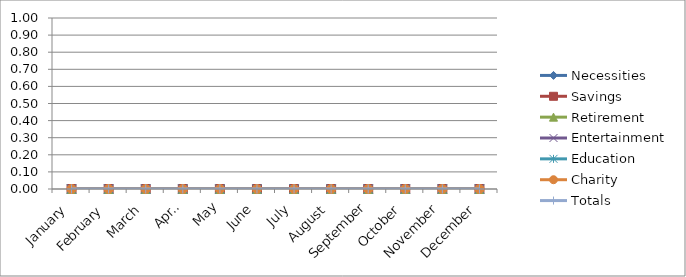
| Category | Necessities | Savings | Retirement | Entertainment | Education | Charity | Totals |
|---|---|---|---|---|---|---|---|
| January | 0 | 0 | 0 | 0 | 0 | 0 | 0 |
| February | 0 | 0 | 0 | 0 | 0 | 0 | 0 |
| March | 0 | 0 | 0 | 0 | 0 | 0 | 0 |
| April | 0 | 0 | 0 | 0 | 0 | 0 | 0 |
| May | 0 | 0 | 0 | 0 | 0 | 0 | 0 |
| June | 0 | 0 | 0 | 0 | 0 | 0 | 0 |
| July | 0 | 0 | 0 | 0 | 0 | 0 | 0 |
| August | 0 | 0 | 0 | 0 | 0 | 0 | 0 |
| September | 0 | 0 | 0 | 0 | 0 | 0 | 0 |
| October | 0 | 0 | 0 | 0 | 0 | 0 | 0 |
| November | 0 | 0 | 0 | 0 | 0 | 0 | 0 |
| December | 0 | 0 | 0 | 0 | 0 | 0 | 0 |